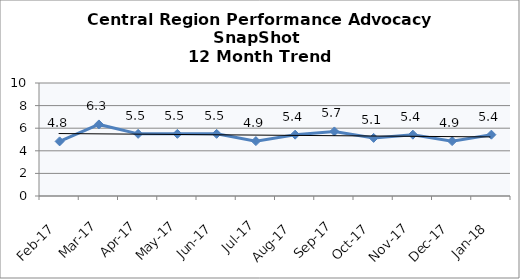
| Category | Central Region |
|---|---|
| Feb-17 | 4.833 |
| Mar-17 | 6.333 |
| Apr-17 | 5.5 |
| May-17 | 5.5 |
| Jun-17 | 5.5 |
| Jul-17 | 4.857 |
| Aug-17 | 5.429 |
| Sep-17 | 5.714 |
| Oct-17 | 5.143 |
| Nov-17 | 5.429 |
| Dec-17 | 4.857 |
| Jan-18 | 5.429 |